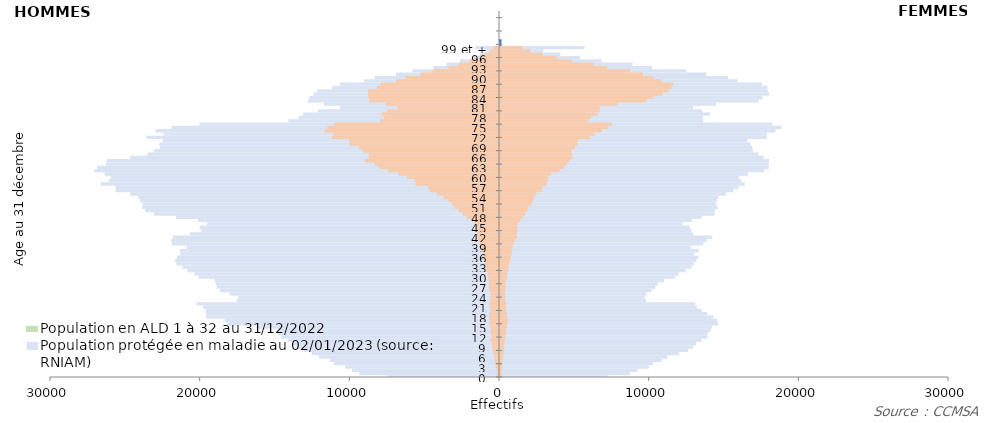
| Category | âge | Femmes RNIAM | Femmes en ALD | Hommes neg RNIAM | Hommes neg ALD |
|---|---|---|---|---|---|
| 0 |  | 7178 | 68 | -7407 | -93 |
| 1 |  | 8679 | 114 | -9327 | -151 |
| 2 |  | 9203 | 108 | -9827 | -128 |
| 3 |  | 9940 | 150 | -10268 | -186 |
| 4 |  | 10221 | 148 | -11034 | -269 |
| 5 |  | 10795 | 177 | -11292 | -271 |
| 6 |  | 11188 | 186 | -12028 | -308 |
| 7 |  | 11967 | 248 | -12515 | -369 |
| 8 |  | 12555 | 263 | -13077 | -429 |
| 9 |  | 12901 | 282 | -13592 | -461 |
| 10 |  | 13107 | 278 | -13738 | -471 |
| 11 |  | 13466 | 320 | -14123 | -567 |
| 12 |  | 13866 | 354 | -14552 | -509 |
| 13 |  | 13871 | 414 | -14763 | -551 |
| 14 |  | 14056 | 411 | -14771 | -567 |
| 15 |  | 14151 | 463 | -16188 | -555 |
| 16 |  | 14570 | 498 | -18148 | -634 |
| 17 |  | 14515 | 529 | -18323 | -622 |
| 18 |  | 14261 | 465 | -19553 | -636 |
| 19 |  | 13831 | 455 | -19584 | -645 |
| 20 |  | 13481 | 419 | -19596 | -572 |
| 21 |  | 13158 | 413 | -19779 | -604 |
| 22 |  | 13047 | 434 | -20210 | -641 |
| 23 |  | 9763 | 350 | -17517 | -567 |
| 24 |  | 9688 | 346 | -17421 | -569 |
| 25 |  | 9793 | 334 | -18007 | -557 |
| 26 |  | 10129 | 370 | -18637 | -621 |
| 27 |  | 10379 | 379 | -18859 | -693 |
| 28 |  | 10532 | 385 | -18919 | -666 |
| 29 |  | 10971 | 384 | -19004 | -667 |
| 30 |  | 11722 | 477 | -20077 | -736 |
| 31 |  | 11956 | 486 | -20363 | -771 |
| 32 |  | 12404 | 517 | -20833 | -901 |
| 33 |  | 12804 | 590 | -21138 | -865 |
| 34 |  | 12940 | 613 | -21560 | -932 |
| 35 |  | 13116 | 702 | -21634 | -963 |
| 36 |  | 13255 | 725 | -21525 | -1046 |
| 37 |  | 12974 | 782 | -21269 | -1036 |
| 38 |  | 13283 | 807 | -21343 | -1148 |
| 39 |  | 12738 | 849 | -20861 | -1190 |
| 40 |  | 13587 | 893 | -21861 | -1299 |
| 41 |  | 13809 | 976 | -21915 | -1357 |
| 42 |  | 14186 | 1129 | -21792 | -1415 |
| 43 |  | 12919 | 1093 | -20669 | -1477 |
| 44 |  | 12797 | 1170 | -19888 | -1432 |
| 45 |  | 12681 | 1149 | -19998 | -1521 |
| 46 |  | 12186 | 1173 | -19497 | -1631 |
| 47 |  | 12815 | 1336 | -20099 | -1785 |
| 48 |  | 13461 | 1505 | -21579 | -2154 |
| 49 |  | 14313 | 1681 | -23056 | -2408 |
| 50 |  | 14364 | 1824 | -23638 | -2680 |
| 51 |  | 14552 | 1895 | -23829 | -2941 |
| 52 |  | 14429 | 2100 | -23829 | -3144 |
| 53 |  | 14478 | 2197 | -24008 | -3378 |
| 54 |  | 14592 | 2286 | -24104 | -3704 |
| 55 |  | 15104 | 2430 | -24637 | -4158 |
| 56 |  | 15589 | 2751 | -25621 | -4631 |
| 57 |  | 15921 | 2828 | -25617 | -4729 |
| 58 |  | 16355 | 3107 | -26604 | -5585 |
| 59 |  | 16103 | 3219 | -26075 | -5637 |
| 60 |  | 15968 | 3190 | -25939 | -6148 |
| 61 |  | 16562 | 3434 | -26352 | -6693 |
| 62 |  | 17650 | 3974 | -27029 | -7404 |
| 63 |  | 17955 | 4287 | -26842 | -8005 |
| 64 |  | 17940 | 4453 | -26268 | -8300 |
| 65 |  | 17984 | 4629 | -26214 | -8966 |
| 66 |  | 17614 | 4852 | -24642 | -8704 |
| 67 |  | 17267 | 4812 | -23486 | -8692 |
| 68 |  | 16891 | 4770 | -23037 | -9111 |
| 69 |  | 16856 | 4998 | -22642 | -9362 |
| 70 |  | 16741 | 5174 | -22704 | -9975 |
| 71 |  | 16540 | 5220 | -22478 | -10022 |
| 72 |  | 17823 | 6006 | -23558 | -11172 |
| 73 |  | 17832 | 6301 | -22414 | -11091 |
| 74 |  | 18410 | 6786 | -22954 | -11667 |
| 75 |  | 18815 | 7197 | -21884 | -11464 |
| 76 |  | 18206 | 7473 | -20011 | -11006 |
| 77 |  | 13578 | 5853 | -14078 | -7949 |
| 78 |  | 13543 | 6087 | -13386 | -7685 |
| 79 |  | 14035 | 6548 | -13094 | -7838 |
| 80 |  | 13500 | 6666 | -12098 | -7456 |
| 81 |  | 12895 | 6651 | -10620 | -6764 |
| 82 |  | 14436 | 7829 | -11713 | -7572 |
| 83 |  | 17286 | 9777 | -12768 | -8673 |
| 84 |  | 17535 | 10257 | -12660 | -8730 |
| 85 |  | 17980 | 10840 | -12395 | -8737 |
| 86 |  | 17897 | 11265 | -12169 | -8751 |
| 87 |  | 17866 | 11443 | -11144 | -8143 |
| 88 |  | 17506 | 11578 | -10626 | -7890 |
| 89 |  | 15886 | 10763 | -9013 | -6881 |
| 90 |  | 15230 | 10229 | -8284 | -6251 |
| 91 |  | 13789 | 9552 | -6877 | -5244 |
| 92 |  | 12451 | 8692 | -5792 | -4410 |
| 93 |  | 10153 | 7135 | -4384 | -3376 |
| 94 |  | 8856 | 6262 | -3512 | -2667 |
| 95 |  | 6792 | 4795 | -2595 | -1982 |
| 96 |  | 5342 | 3798 | -1793 | -1338 |
| 97 |  | 4038 | 2822 | -1273 | -924 |
| 98 |  | 2902 | 2016 | -827 | -590 |
| 99 et + |  | 5655 | 1482 | -1574 | -352 |